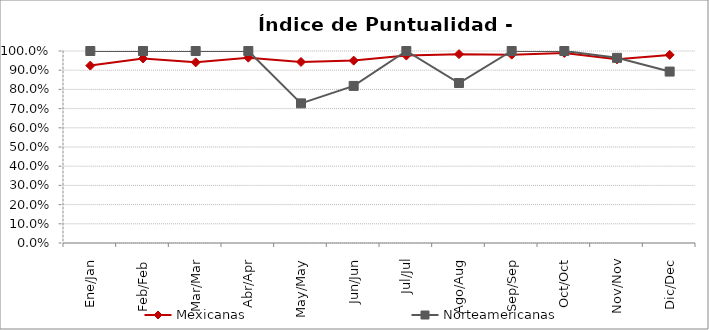
| Category | Mexicanas | Norteamericanas |
|---|---|---|
| Ene/Jan | 0.924 | 1 |
| Feb/Feb | 0.961 | 1 |
| Mar/Mar | 0.941 | 1 |
| Abr/Apr | 0.965 | 1 |
| May/May | 0.943 | 0.727 |
| Jun/Jun | 0.95 | 0.818 |
| Jul/Jul | 0.976 | 1 |
| Ago/Aug | 0.984 | 0.833 |
| Sep/Sep | 0.981 | 1 |
| Oct/Oct | 0.99 | 1 |
| Nov/Nov | 0.957 | 0.964 |
| Dic/Dec | 0.98 | 0.893 |